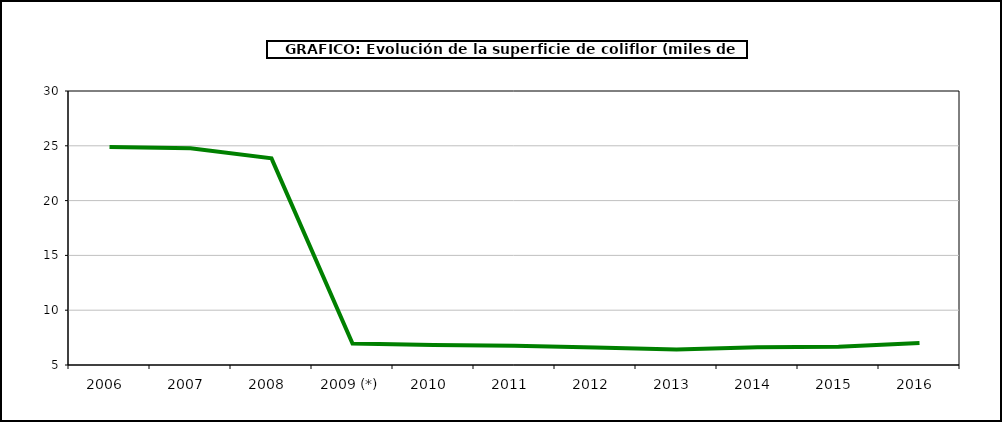
| Category | superficie |
|---|---|
| 2006  | 24.9 |
| 2007  | 24.768 |
| 2008  | 23.857 |
| 2009 (*) | 6.965 |
| 2010  | 6.826 |
| 2011  | 6.759 |
| 2012  | 6.587 |
| 2013  | 6.418 |
| 2014  | 6.61 |
| 2015  | 6.664 |
| 2016  | 7.014 |